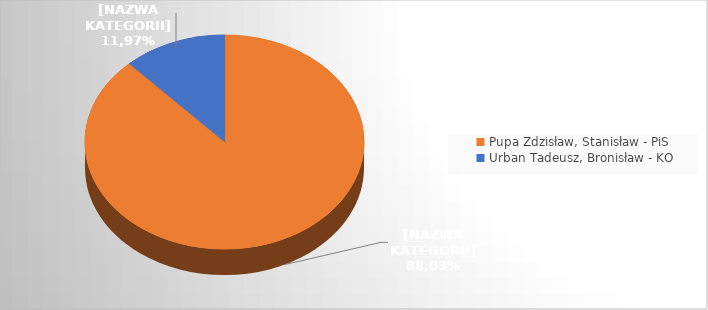
| Category | Series 0 |
|---|---|
| Pupa Zdzisław, Stanisław - PiS | 0.88 |
| Urban Tadeusz, Bronisław - KO | 0.12 |